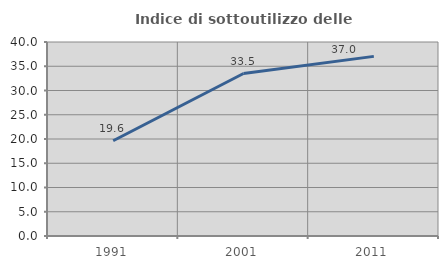
| Category | Indice di sottoutilizzo delle abitazioni  |
|---|---|
| 1991.0 | 19.646 |
| 2001.0 | 33.499 |
| 2011.0 | 37.037 |